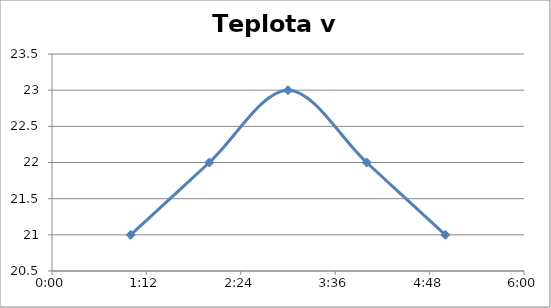
| Category | teplota |
|---|---|
| 0.041666666666666664 | 21 |
| 0.0833333333333333 | 22 |
| 0.333333333333333 | 23 |
| 0.375 | 22 |
| 0.416666666666667 | 21 |